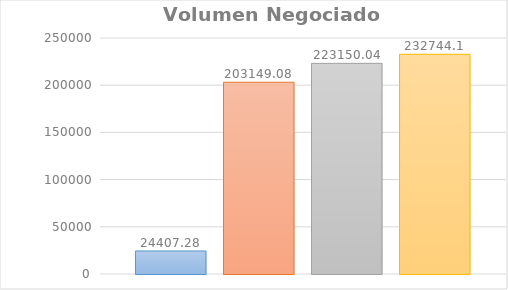
| Category | Lunes | Martes | Miercoles | Jueves | Viernes |
|---|---|---|---|---|---|
| 0 | 24407.28 | 203149.08 | 223150.04 | 232744.1 |  |